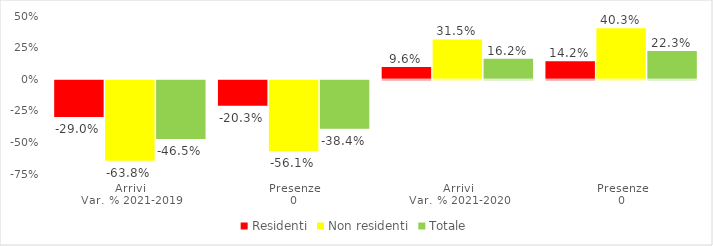
| Category | Residenti | Non residenti | Totale |
|---|---|---|---|
| 0 | -0.29 | -0.638 | -0.465 |
| 1 | -0.203 | -0.561 | -0.384 |
| 2 | 0.096 | 0.315 | 0.162 |
| 3 | 0.142 | 0.403 | 0.223 |